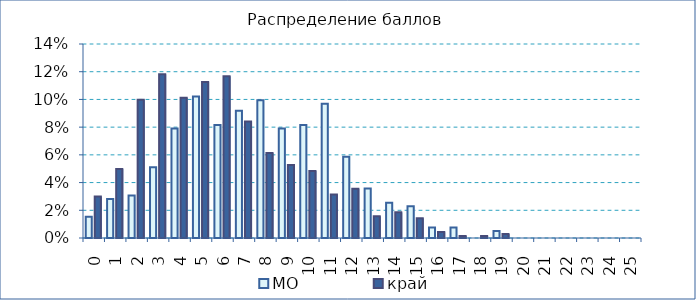
| Category | МО | край |
|---|---|---|
| 0.0 | 0.015 | 0.03 |
| 1.0 | 0.028 | 0.05 |
| 2.0 | 0.031 | 0.1 |
| 3.0 | 0.051 | 0.118 |
| 4.0 | 0.079 | 0.101 |
| 5.0 | 0.102 | 0.113 |
| 6.0 | 0.082 | 0.117 |
| 7.0 | 0.092 | 0.084 |
| 8.0 | 0.099 | 0.061 |
| 9.0 | 0.079 | 0.053 |
| 10.0 | 0.082 | 0.048 |
| 11.0 | 0.097 | 0.031 |
| 12.0 | 0.059 | 0.036 |
| 13.0 | 0.036 | 0.016 |
| 14.0 | 0.026 | 0.019 |
| 15.0 | 0.023 | 0.014 |
| 16.0 | 0.008 | 0.004 |
| 17.0 | 0.008 | 0.001 |
| 18.0 | 0 | 0.001 |
| 19.0 | 0.005 | 0.003 |
| 20.0 | 0 | 0 |
| 21.0 | 0 | 0 |
| 22.0 | 0 | 0 |
| 23.0 | 0 | 0 |
| 24.0 | 0 | 0 |
| 25.0 | 0 | 0 |